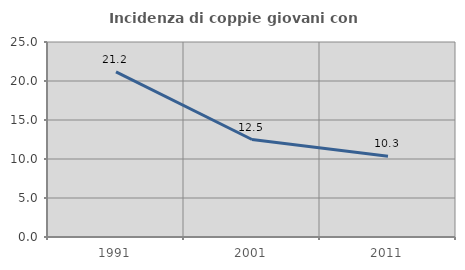
| Category | Incidenza di coppie giovani con figli |
|---|---|
| 1991.0 | 21.164 |
| 2001.0 | 12.5 |
| 2011.0 | 10.345 |